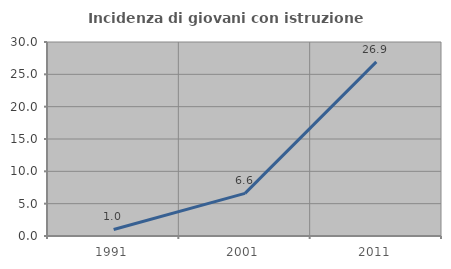
| Category | Incidenza di giovani con istruzione universitaria |
|---|---|
| 1991.0 | 1.01 |
| 2001.0 | 6.593 |
| 2011.0 | 26.923 |